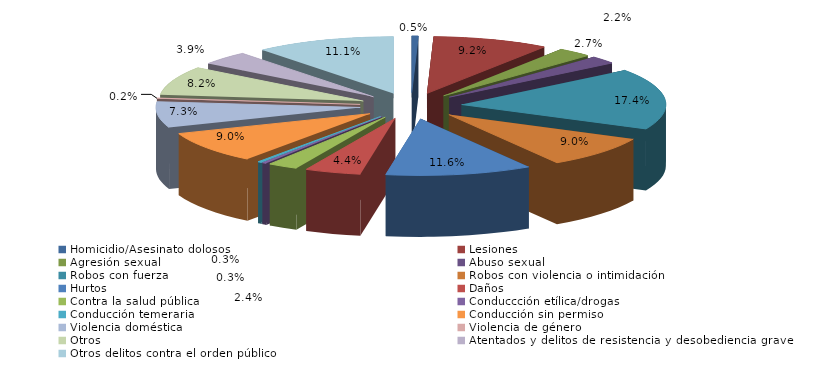
| Category | Series 0 |
|---|---|
| Homicidio/Asesinato dolosos | 3 |
| Lesiones | 54 |
| Agresión sexual | 16 |
| Abuso sexual | 13 |
| Robos con fuerza | 102 |
| Robos con violencia o intimidación | 53 |
| Hurtos | 68 |
| Daños | 26 |
| Contra la salud pública | 14 |
| Conduccción etílica/drogas | 2 |
| Conducción temeraria | 2 |
| Conducción sin permiso | 53 |
| Violencia doméstica | 43 |
| Violencia de género | 1 |
| Otros | 48 |
| Atentados y delitos de resistencia y desobediencia grave | 23 |
| Otros delitos contra el orden público | 65 |